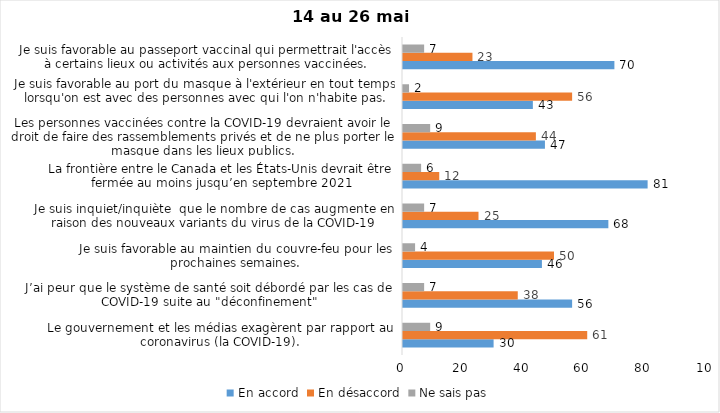
| Category | En accord | En désaccord | Ne sais pas |
|---|---|---|---|
| Le gouvernement et les médias exagèrent par rapport au coronavirus (la COVID-19). | 30 | 61 | 9 |
| J’ai peur que le système de santé soit débordé par les cas de COVID-19 suite au "déconfinement" | 56 | 38 | 7 |
| Je suis favorable au maintien du couvre-feu pour les prochaines semaines. | 46 | 50 | 4 |
| Je suis inquiet/inquiète  que le nombre de cas augmente en raison des nouveaux variants du virus de la COVID-19 | 68 | 25 | 7 |
| La frontière entre le Canada et les États-Unis devrait être fermée au moins jusqu’en septembre 2021 | 81 | 12 | 6 |
| Les personnes vaccinées contre la COVID-19 devraient avoir le droit de faire des rassemblements privés et de ne plus porter le masque dans les lieux publics. | 47 | 44 | 9 |
| Je suis favorable au port du masque à l'extérieur en tout temps lorsqu'on est avec des personnes avec qui l'on n'habite pas. | 43 | 56 | 2 |
| Je suis favorable au passeport vaccinal qui permettrait l'accès à certains lieux ou activités aux personnes vaccinées. | 70 | 23 | 7 |